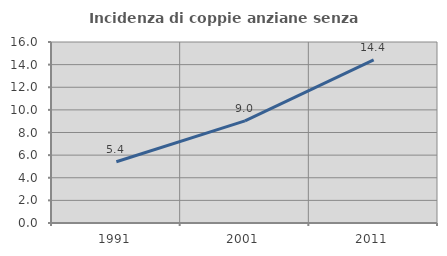
| Category | Incidenza di coppie anziane senza figli  |
|---|---|
| 1991.0 | 5.411 |
| 2001.0 | 9.022 |
| 2011.0 | 14.426 |